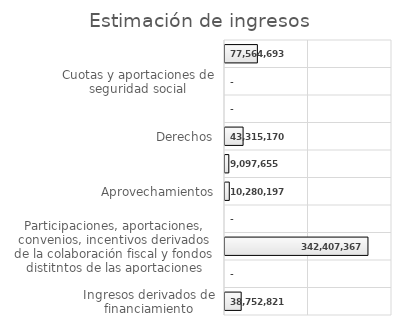
| Category | Series 0 |
|---|---|
| Ingresos derivados de financiamiento | 38752821 |
| Transferencias, asignaciones, subsidios y subvenciones y pensiones y jubilaciones | 0 |
| Participaciones, aportaciones, convenios, incentivos derivados de la colaboración fiscal y fondos distitntos de las aportaciones | 342407367 |
| Ingresos por venta de bienes, prestación de servicios y otros ingresos | 0 |
| Aprovechamientos | 10280197 |
| Productos | 9097655 |
| Derechos | 43315170 |
| Contribuciones de mejoras | 0 |
| Cuotas y aportaciones de seguridad social | 0 |
| Impuestos | 77564693 |